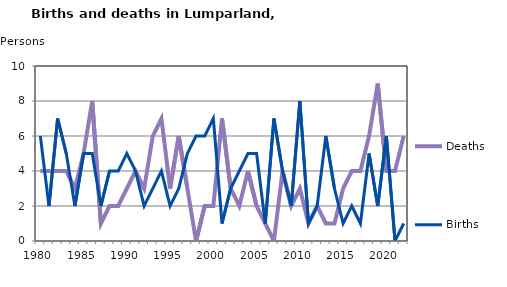
| Category | Deaths | Births |
|---|---|---|
| 1980.0 | 4 | 6 |
| 1981.0 | 4 | 2 |
| 1982.0 | 4 | 7 |
| 1983.0 | 4 | 5 |
| 1984.0 | 3 | 2 |
| 1985.0 | 5 | 5 |
| 1986.0 | 8 | 5 |
| 1987.0 | 1 | 2 |
| 1988.0 | 2 | 4 |
| 1989.0 | 2 | 4 |
| 1990.0 | 3 | 5 |
| 1991.0 | 4 | 4 |
| 1992.0 | 3 | 2 |
| 1993.0 | 6 | 3 |
| 1994.0 | 7 | 4 |
| 1995.0 | 3 | 2 |
| 1996.0 | 6 | 3 |
| 1997.0 | 3 | 5 |
| 1998.0 | 0 | 6 |
| 1999.0 | 2 | 6 |
| 2000.0 | 2 | 7 |
| 2001.0 | 7 | 1 |
| 2002.0 | 3 | 3 |
| 2003.0 | 2 | 4 |
| 2004.0 | 4 | 5 |
| 2005.0 | 2 | 5 |
| 2006.0 | 1 | 1 |
| 2007.0 | 0 | 7 |
| 2008.0 | 4 | 4 |
| 2009.0 | 2 | 2 |
| 2010.0 | 3 | 8 |
| 2011.0 | 1 | 1 |
| 2012.0 | 2 | 2 |
| 2013.0 | 1 | 6 |
| 2014.0 | 1 | 3 |
| 2015.0 | 3 | 1 |
| 2016.0 | 4 | 2 |
| 2017.0 | 4 | 1 |
| 2018.0 | 6 | 5 |
| 2019.0 | 9 | 2 |
| 2020.0 | 4 | 6 |
| 2021.0 | 4 | 0 |
| 2022.0 | 6 | 1 |